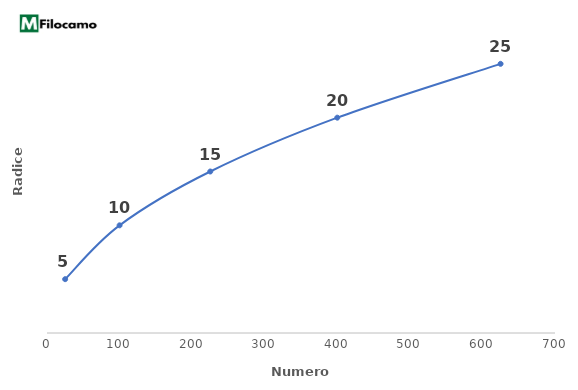
| Category | Series 0 |
|---|---|
| 625.0 | 25 |
| 400.0 | 20 |
| 225.0 | 15 |
| 100.0 | 10 |
| 25.0 | 5 |